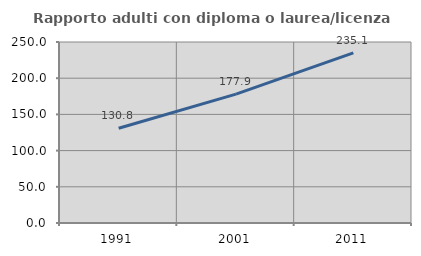
| Category | Rapporto adulti con diploma o laurea/licenza media  |
|---|---|
| 1991.0 | 130.833 |
| 2001.0 | 177.944 |
| 2011.0 | 235.059 |